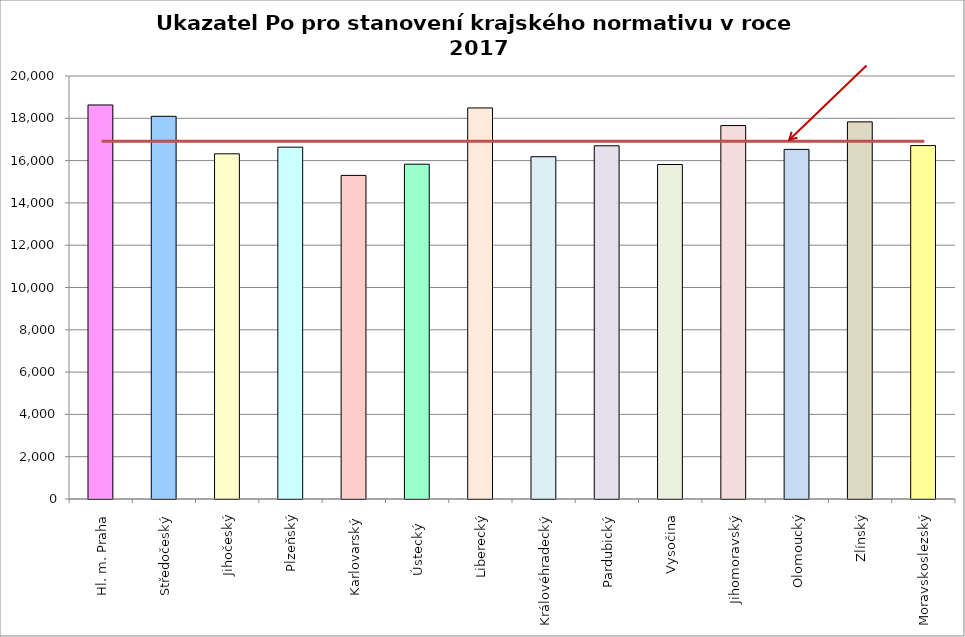
| Category | Series 0 |
|---|---|
| Hl. m. Praha | 18630 |
| Středočeský | 18094.2 |
| Jihočeský | 16321 |
| Plzeňský | 16635 |
| Karlovarský  | 15300 |
| Ústecký   | 15831 |
| Liberecký | 18490 |
| Královéhradecký | 16183 |
| Pardubický | 16700 |
| Vysočina | 15816 |
| Jihomoravský | 17657 |
| Olomoucký | 16530 |
| Zlínský | 17832 |
| Moravskoslezský | 16710 |